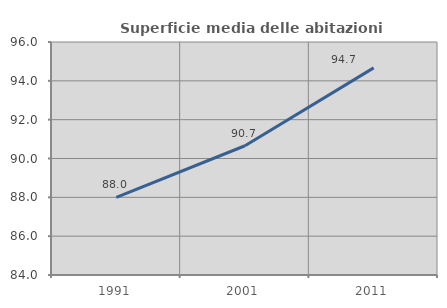
| Category | Superficie media delle abitazioni occupate |
|---|---|
| 1991.0 | 87.993 |
| 2001.0 | 90.657 |
| 2011.0 | 94.667 |